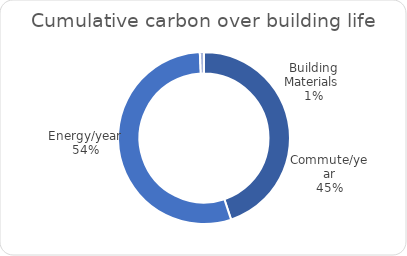
| Category | Series 0 |
|---|---|
| Commute/year | 0.449 |
| Energy/year | 0.543 |
| Building Materials  | 0.008 |